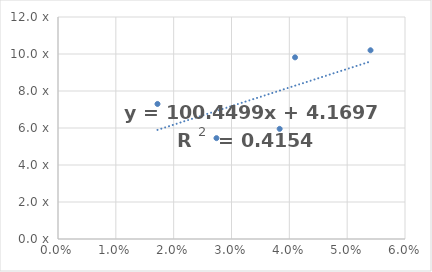
| Category | x R Ex |
|---|---|
| 0.040988754765697744 | 9.819 |
| 0.05403936877057136 | 10.201 |
| 0.0172041929622333 | 7.299 |
| 0.027402333828162817 | 5.452 |
| 0.03832798286475936 | 5.953 |